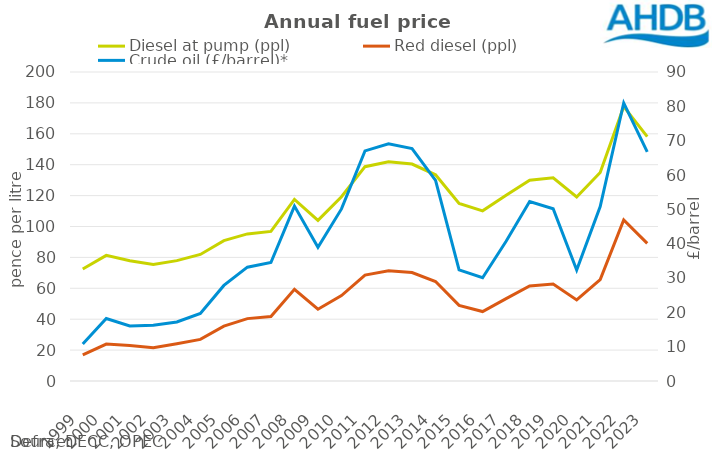
| Category | Diesel at pump (ppl) | Red diesel (ppl) |
|---|---|---|
| 1999.0 | 72.49 | 16.85 |
| 2000.0 | 81.34 | 23.92 |
| 2001.0 | 77.84 | 23.05 |
| 2002.0 | 75.46 | 21.53 |
| 2003.0 | 77.92 | 24.12 |
| 2004.0 | 81.91 | 26.92 |
| 2005.0 | 90.86 | 35.55 |
| 2006.0 | 95.209 | 40.369 |
| 2007.0 | 96.848 | 41.764 |
| 2008.0 | 117.511 | 59.37 |
| 2009.0 | 103.93 | 46.436 |
| 2010.0 | 119.259 | 55.297 |
| 2011.0 | 138.716 | 68.583 |
| 2012.0 | 141.828 | 71.38 |
| 2013.0 | 140.405 | 70.194 |
| 2014.0 | 133.458 | 64.405 |
| 2015.0 | 114.898 | 48.939 |
| 2016.0 | 110.128 | 44.963 |
| 2017.0 | 120.15 | 53.314 |
| 2018.0 | 129.982 | 61.509 |
| 2019.0 | 131.475 | 62.752 |
| 2020.0 | 119.135 | 52.47 |
| 2021.0 | 134.936 | 65.637 |
| 2022.0 | 177.658 | 104.269 |
| 2023.0 | 158.189 | 89.054 |